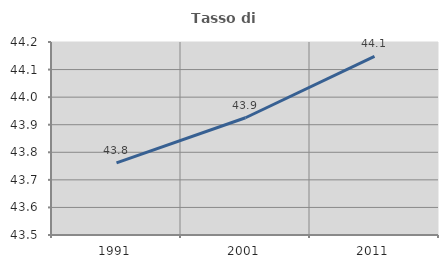
| Category | Tasso di occupazione   |
|---|---|
| 1991.0 | 43.761 |
| 2001.0 | 43.925 |
| 2011.0 | 44.148 |